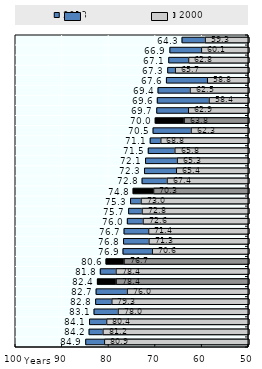
| Category | 2018 | 2000 |
|---|---|---|
| Papua New Guinea | 64.263 | 59.265 |
| Myanmar | 66.867 | 60.063 |
| Pakistan | 67.114 | 62.82 |
| Fiji | 67.341 | 65.687 |
| Lao PDR | 67.61 | 58.803 |
| India | 69.416 | 62.505 |
| Cambodia | 69.57 | 58.432 |
| Mongolia | 69.689 | 62.869 |
| Asia Pacific-LM/L | 70.013 | 63.771 |
| Nepal | 70.478 | 62.288 |
| Philippines | 71.095 | 68.793 |
| Indonesia | 71.509 | 65.772 |
| Korea, DPR | 72.095 | 65.268 |
| Bangladesh | 72.32 | 65.447 |
| Solomon Islands | 72.835 | 67.442 |
| Asia Pacific-UM | 74.757 | 70.327 |
| Viet Nam | 75.317 | 73.025 |
| Brunei Darussalam | 75.722 | 72.809 |
| Malaysia | 75.997 | 72.594 |
| China | 76.704 | 71.397 |
| Sri Lanka | 76.812 | 71.333 |
| Thailand | 76.931 | 70.623 |
| OECD | 80.568 | 76.668 |
| New Zealand | 81.8 | 78.4 |
| Asia Pacific-H | 82.421 | 78.368 |
| Korea, Rep. | 82.7 | 76 |
| Australia | 82.8 | 79.3 |
| Singapore | 83.146 | 77.951 |
| Macau, China | 84.118 | 80.407 |
| Japan | 84.211 | 81.2 |
| Hong Kong, China | 84.934 | 80.878 |